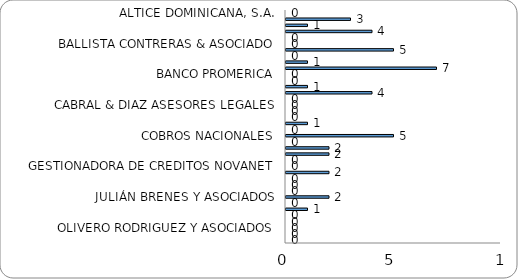
| Category | Series 0 |
|---|---|
| ALTICE DOMINICANA, S.A. | 0 |
| A & R CONSULTORES LEGALES | 3 |
| ASC. POPULAR DE AHORROS Y PRESTAMOS | 1 |
| ASEREMIN | 4 |
| AYUNTAMIENTO DEL DISTRITO NACIONAL, ADN | 0 |
| BALLISTA CONTRERAS & ASOCIADO | 0 |
| BANCO ADEMI | 5 |
| BANCO BHD LEON | 0 |
| BANCO CARIBE | 1 |
| BANCO POPULAR DOMINICANO | 7 |
| BANCO PROMERICA | 0 |
| BANCO SANTA CRUZ | 0 |
| BANESCO | 1 |
| BANRESERVAS | 4 |
| BAUGIL INVERSIONES Y PRÉSTAMOS, S.R.L. | 0 |
| CABRAL & DIAZ ASESORES LEGALES | 0 |
| CHAMI ISA OFICINA DE ABOGADOS | 0 |
| CLARO COMPANIA DOMINICANA DE TELEFONOS | 0 |
| COBEX. S.R.L. | 1 |
| COBROS LEGALES PEGUERO MATEO | 0 |
| COBROS NACIONALES | 5 |
| COLECTORES LEGALES | 0 |
| ESTUDIO LEGAL SOSA EVERTZ | 2 |
| FBGG SERVICIOS LEGALES | 2 |
| FINANCIERA CREDICEFI | 0 |
| GESTIONADORA DE CREDITOS NOVANET | 0 |
| GESTIONADORA DE CRÉDITOS, S. A. | 2 |
| GESTORA DE COBROS GUERRERO GIL Y ASOCIADOS | 0 |
| INVERSIONES 3R | 0 |
| INVERSIONES CROUSET | 0 |
| JULIÁN BRENES Y ASOCIADOS | 2 |
| L & R COMERCIAL SRL | 0 |
| MOYA & ASOCIADO | 1 |
| NO DEFINIDA | 0 |
| OFICINA DE ABOGADOS SOLUCIONES CARVAC | 0 |
| OLIVERO RODRIGUEZ Y ASOCIADOS | 0 |
| OTROS | 0 |
| PAREDES CUEVAS & ASOCIADOS | 0 |